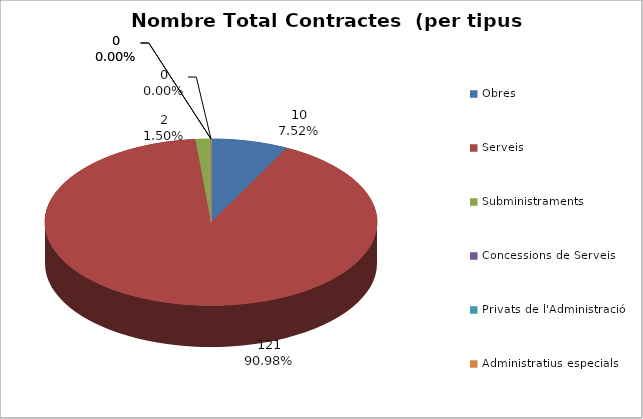
| Category | Nombre Total Contractes |
|---|---|
| Obres | 10 |
| Serveis | 121 |
| Subministraments | 2 |
| Concessions de Serveis | 0 |
| Privats de l'Administració | 0 |
| Administratius especials | 0 |